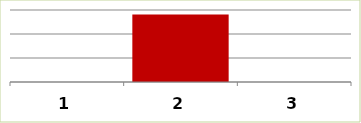
| Category | Series 0 |
|---|---|
| 0 | 0 |
| 1 | 1404000 |
| 2 | 0 |